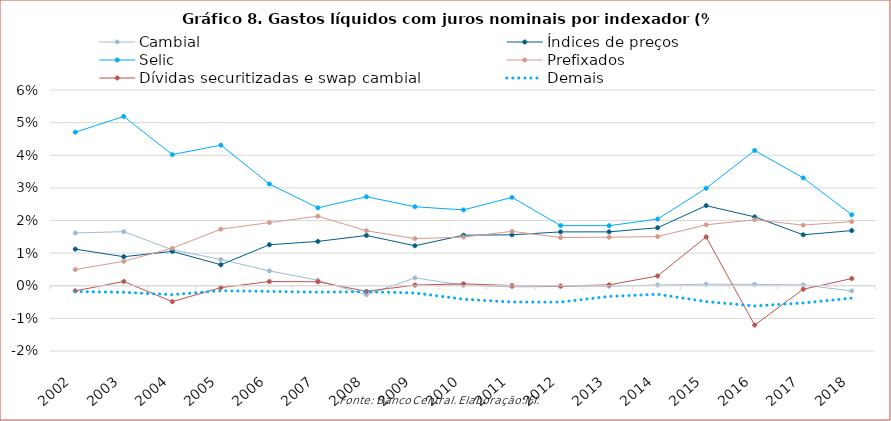
| Category | Cambial | Índices de preços | Selic | Prefixados | Dívidas securitizadas e swap cambial | Demais |
|---|---|---|---|---|---|---|
| 2002.0 | 0.016 | 0.011 | 0.047 | 0.005 | -0.002 | -0.002 |
| 2003.0 | 0.017 | 0.009 | 0.052 | 0.007 | 0.001 | -0.002 |
| 2004.0 | 0.011 | 0.011 | 0.04 | 0.012 | -0.005 | -0.003 |
| 2005.0 | 0.008 | 0.006 | 0.043 | 0.017 | -0.001 | -0.002 |
| 2006.0 | 0.005 | 0.013 | 0.031 | 0.019 | 0.001 | -0.002 |
| 2007.0 | 0.002 | 0.014 | 0.024 | 0.021 | 0.001 | -0.002 |
| 2008.0 | -0.003 | 0.015 | 0.027 | 0.017 | -0.002 | -0.002 |
| 2009.0 | 0.002 | 0.012 | 0.024 | 0.014 | 0 | -0.002 |
| 2010.0 | 0 | 0.015 | 0.023 | 0.015 | 0.001 | -0.004 |
| 2011.0 | 0 | 0.016 | 0.027 | 0.017 | 0 | -0.005 |
| 2012.0 | 0 | 0.017 | 0.018 | 0.015 | 0 | -0.005 |
| 2013.0 | 0 | 0.017 | 0.018 | 0.015 | 0 | -0.003 |
| 2014.0 | 0 | 0.018 | 0.02 | 0.015 | 0.003 | -0.003 |
| 2015.0 | 0 | 0.025 | 0.03 | 0.019 | 0.015 | -0.005 |
| 2016.0 | 0 | 0.021 | 0.041 | 0.02 | -0.012 | -0.006 |
| 2017.0 | 0 | 0.016 | 0.033 | 0.019 | -0.001 | -0.005 |
| 2018.0 | -0.002 | 0.017 | 0.022 | 0.02 | 0.002 | -0.004 |